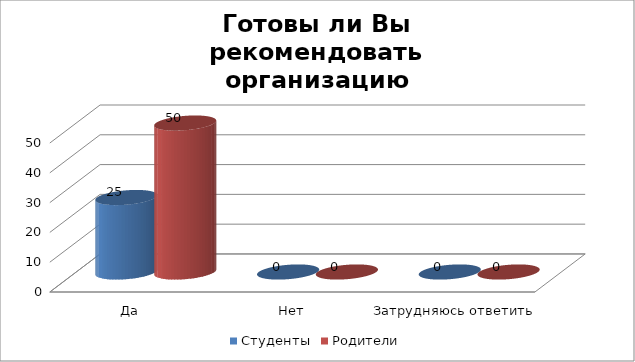
| Category | Студенты | Родители |
|---|---|---|
| Да | 25 | 50 |
| Нет | 0 | 0 |
| Затрудняюсь ответить | 0 | 0 |